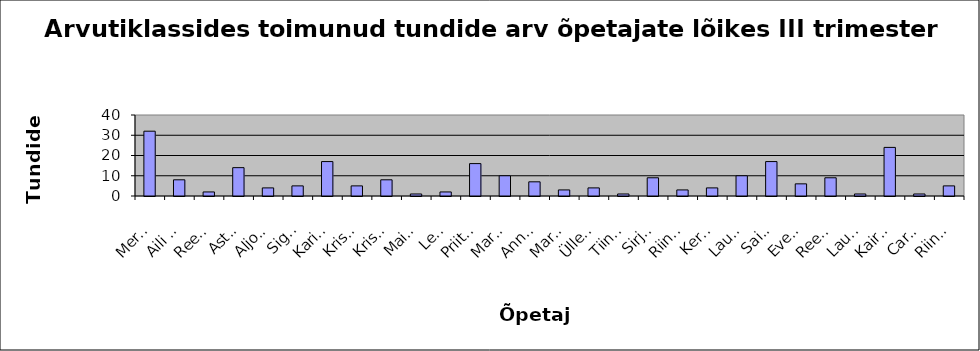
| Category | Series 0 |
|---|---|
| Merlin Saulep | 32 |
| Aili Kadaste | 8 |
| Reene Õigus | 2 |
| Astrid Salumets | 14 |
| Aljona Maalmann | 4 |
| Signe Varendi | 5 |
| Karin Tõevere | 17 |
| Kristiina Järve | 5 |
| Kristel Kruuse | 8 |
| Maive Meister | 1 |
| Lembi Aart | 2 |
| Priit Pensa | 16 |
| Marit Toome | 10 |
| Anneli Oja | 7 |
| Mare Vakker | 3 |
| Ülle Kepler | 4 |
| Tiina Ruus | 1 |
| Sirje Pormeister | 9 |
| Riina Karpov | 3 |
| Kersti Krüünvald | 4 |
| Laura Kuusik | 10 |
| Saima Alliksaar | 17 |
| Eve Rungi | 6 |
| Reet Tallo | 9 |
| Laura Allikvee | 1 |
| Kaire Sumberg | 24 |
| Carmen Luts | 1 |
| Riina Visnapuu | 5 |